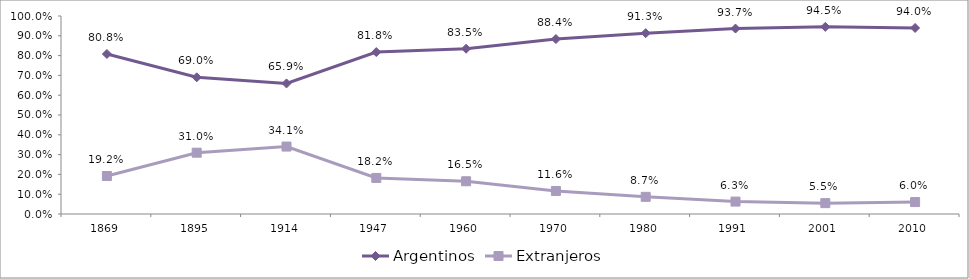
| Category | Argentinos | Extranjeros |
|---|---|---|
| 1869.0 | 0.808 | 0.192 |
| 1895.0 | 0.69 | 0.31 |
| 1914.0 | 0.659 | 0.341 |
| 1947.0 | 0.818 | 0.182 |
| 1960.0 | 0.835 | 0.165 |
| 1970.0 | 0.884 | 0.116 |
| 1980.0 | 0.913 | 0.087 |
| 1991.0 | 0.937 | 0.063 |
| 2001.0 | 0.945 | 0.055 |
| 2010.0 | 0.94 | 0.06 |